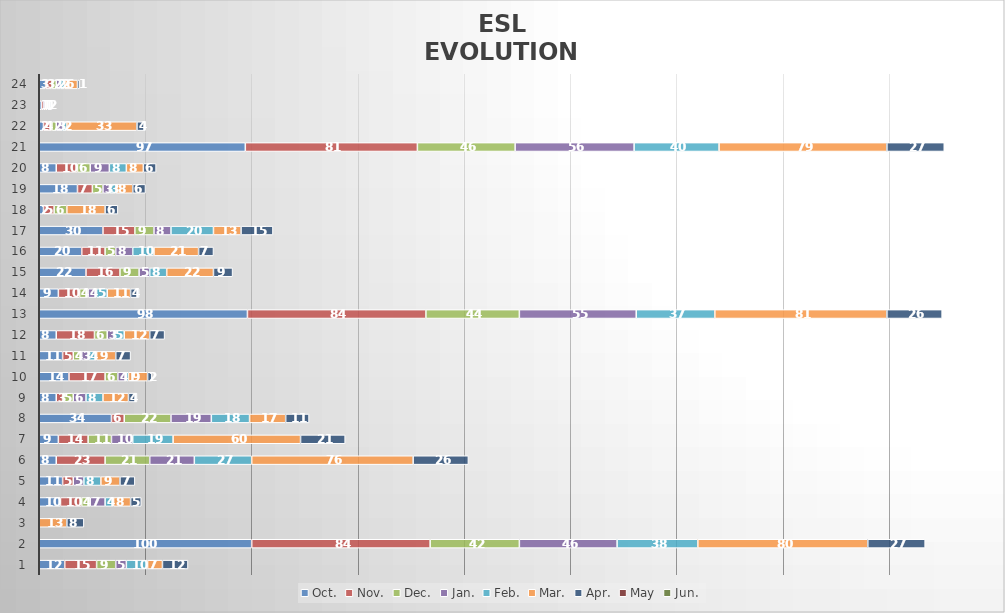
| Category | Oct. | Nov. | Dec. | Jan. | Feb. | Mar. | Apr. | May | Jun. |
|---|---|---|---|---|---|---|---|---|---|
| 1.0 | 12 | 15 | 9 | 5 | 10 | 7 | 12 | 0 | 0 |
| 2.0 | 100 | 84 | 42 | 46 | 38 | 80 | 27 | 0 | 0 |
| 3.0 | 0 | 0 | 0 | 0 | 0 | 13 | 8 | 0 | 0 |
| 4.0 | 10 | 10 | 4 | 7 | 4 | 8 | 5 | 0 | 0 |
| 5.0 | 11 | 5 | 0 | 5 | 8 | 9 | 7 | 0 | 0 |
| 6.0 | 8 | 23 | 21 | 21 | 27 | 76 | 26 | 0 | 0 |
| 7.0 | 9 | 14 | 11 | 10 | 19 | 60 | 21 | 0 | 0 |
| 8.0 | 34 | 6 | 22 | 19 | 18 | 17 | 11 | 0 | 0 |
| 9.0 | 8 | 3 | 5 | 6 | 8 | 12 | 4 | 0 | 0 |
| 10.0 | 14 | 17 | 6 | 4 | 1 | 9 | 2 | 0 | 0 |
| 11.0 | 11 | 5 | 4 | 3 | 4 | 9 | 7 | 0 | 0 |
| 12.0 | 8 | 18 | 6 | 3 | 5 | 12 | 7 | 0 | 0 |
| 13.0 | 98 | 84 | 44 | 55 | 37 | 81 | 26 | 0 | 0 |
| 14.0 | 9 | 10 | 4 | 4 | 5 | 11 | 4 | 0 | 0 |
| 15.0 | 22 | 16 | 9 | 5 | 8 | 22 | 9 | 0 | 0 |
| 16.0 | 20 | 11 | 5 | 8 | 10 | 21 | 7 | 0 | 0 |
| 17.0 | 30 | 15 | 9 | 8 | 20 | 13 | 15 | 0 | 0 |
| 18.0 | 2 | 5 | 6 | 0 | 0 | 18 | 6 | 0 | 0 |
| 19.0 | 18 | 7 | 5 | 3 | 3 | 8 | 6 | 0 | 0 |
| 20.0 | 8 | 10 | 6 | 9 | 8 | 8 | 6 | 0 | 0 |
| 21.0 | 97 | 81 | 46 | 56 | 40 | 79 | 27 | 0 | 0 |
| 22.0 | 2 | 4 | 2 | 3 | 2 | 33 | 4 | 0 | 0 |
| 23.0 | 1 | 1 | 0 | 1 | 0 | 1 | 2 | 0 | 0 |
| 24.0 | 3 | 3 | 2 | 2 | 2 | 6 | 1 | 0 | 0 |